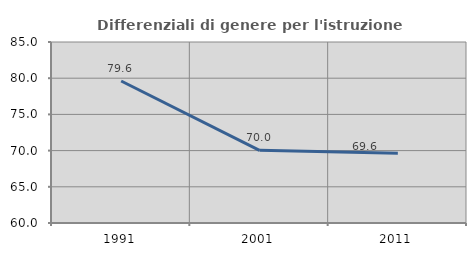
| Category | Differenziali di genere per l'istruzione superiore |
|---|---|
| 1991.0 | 79.609 |
| 2001.0 | 70.043 |
| 2011.0 | 69.644 |